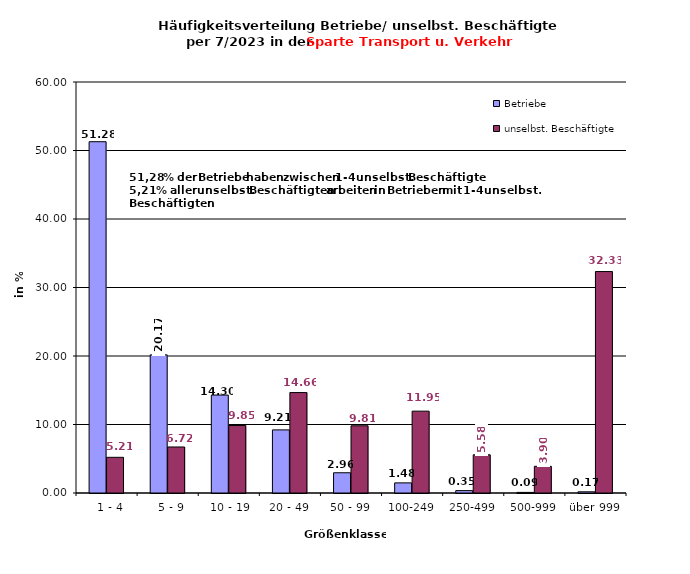
| Category | Betriebe | unselbst. Beschäftigte |
|---|---|---|
|   1 - 4 | 51.282 | 5.209 |
|   5 - 9 | 20.165 | 6.719 |
|  10 - 19 | 14.298 | 9.847 |
| 20 - 49 | 9.213 | 14.66 |
| 50 - 99 | 2.955 | 9.814 |
| 100-249 | 1.478 | 11.95 |
| 250-499 | 0.348 | 5.576 |
| 500-999 | 0.087 | 3.898 |
| über 999 | 0.174 | 32.327 |